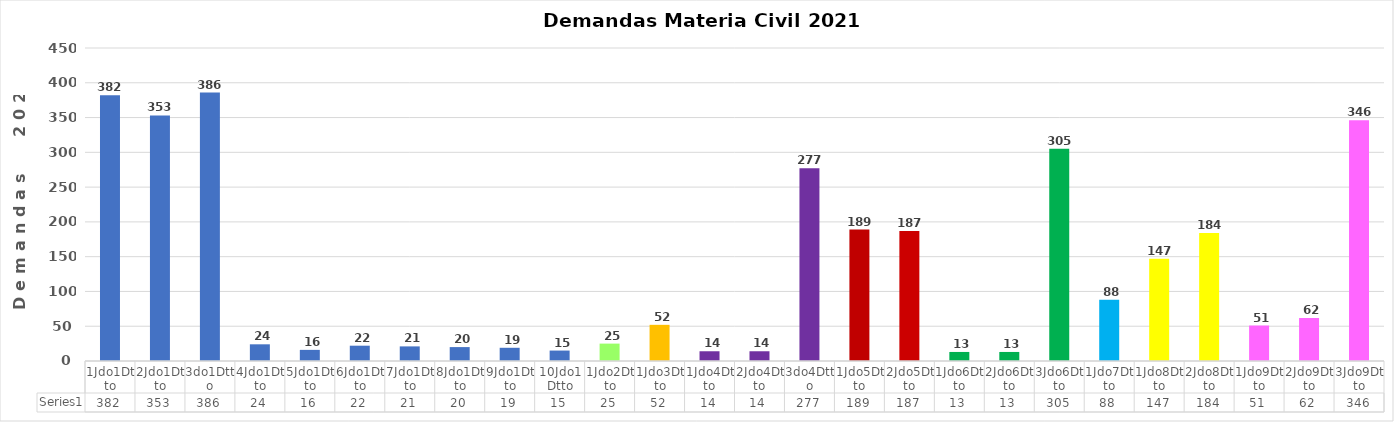
| Category | Series 0 |
|---|---|
| 1Jdo1Dtto | 382 |
| 2Jdo1Dtto | 353 |
| 3do1Dtto | 386 |
| 4Jdo1Dtto | 24 |
| 5Jdo1Dtto | 16 |
| 6Jdo1Dtto | 22 |
| 7Jdo1Dtto | 21 |
| 8Jdo1Dtto | 20 |
| 9Jdo1Dtto | 19 |
| 10Jdo1Dtto | 15 |
| 1Jdo2Dtto | 25 |
| 1Jdo3Dtto | 52 |
| 1Jdo4Dtto | 14 |
| 2Jdo4Dtto | 14 |
| 3do4Dtto | 277 |
| 1Jdo5Dtto | 189 |
| 2Jdo5Dtto | 187 |
| 1Jdo6Dtto | 13 |
| 2Jdo6Dtto | 13 |
| 3Jdo6Dtto | 305 |
| 1Jdo7Dtto | 88 |
| 1Jdo8Dtto | 147 |
| 2Jdo8Dtto | 184 |
| 1Jdo9Dtto | 51 |
| 2Jdo9Dtto | 62 |
| 3Jdo9Dtto | 346 |